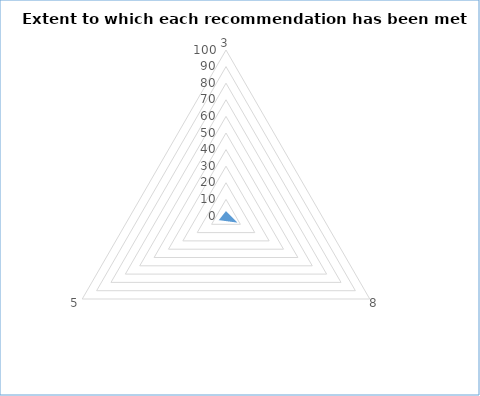
| Category | Series 0 | Series 1 |
|---|---|---|
| 3.0 | 3 | 0 |
| 8.0 | 8 | 0 |
| 5.0 | 5 | 0 |